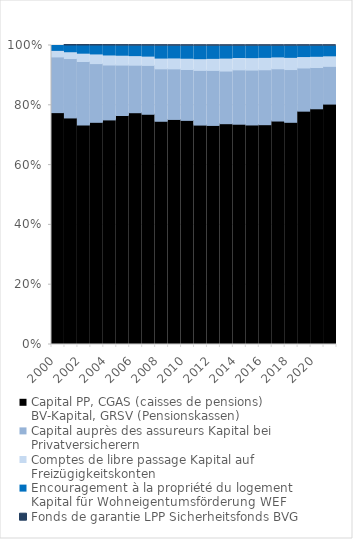
| Category | Capital PP, CGAS (caisses de pensions) | Capital auprès des assureurs | Comptes de libre passage | Encouragement à la propriété du logement | Fonds de garantie LPP |
|---|---|---|---|---|---|
| 2000 | 0.776 | 0.186 | 0.022 | 0.016 | 0 |
| 2001 | 0.758 | 0.199 | 0.023 | 0.021 | 0 |
| 2002 | 0.734 | 0.212 | 0.028 | 0.026 | 0 |
| 2003 | 0.743 | 0.196 | 0.032 | 0.028 | 0 |
| 2004 | 0.751 | 0.184 | 0.034 | 0.031 | 0 |
| 2005 | 0.766 | 0.169 | 0.033 | 0.032 | 0 |
| 2006 | 0.775 | 0.159 | 0.032 | 0.033 | 0.001 |
| 2007 | 0.77 | 0.163 | 0.031 | 0.035 | 0.001 |
| 2008 | 0.747 | 0.175 | 0.036 | 0.041 | 0.001 |
| 2009 | 0.753 | 0.169 | 0.037 | 0.041 | 0.001 |
| 2010 | 0.75 | 0.17 | 0.038 | 0.042 | 0.001 |
| 2011 | 0.734 | 0.183 | 0.039 | 0.043 | 0.001 |
| 2012 | 0.733 | 0.184 | 0.04 | 0.042 | 0.001 |
| 2013 | 0.738 | 0.176 | 0.043 | 0.041 | 0.001 |
| 2014 | 0.737 | 0.182 | 0.041 | 0.039 | 0.001 |
| 2015 | 0.734 | 0.184 | 0.042 | 0.039 | 0.001 |
| 2016 | 0.735 | 0.184 | 0.041 | 0.039 | 0.001 |
| 2017 | 0.747 | 0.175 | 0.04 | 0.037 | 0.001 |
| 2018 | 0.743 | 0.176 | 0.041 | 0.039 | 0.001 |
| 2019 | 0.78 | 0.144 | 0.038 | 0.036 | 0.001 |
| 2020 | 0.788 | 0.138 | 0.038 | 0.035 | 0.001 |
| 2021 | 0.804 | 0.126 | 0.035 | 0.034 | 0.001 |